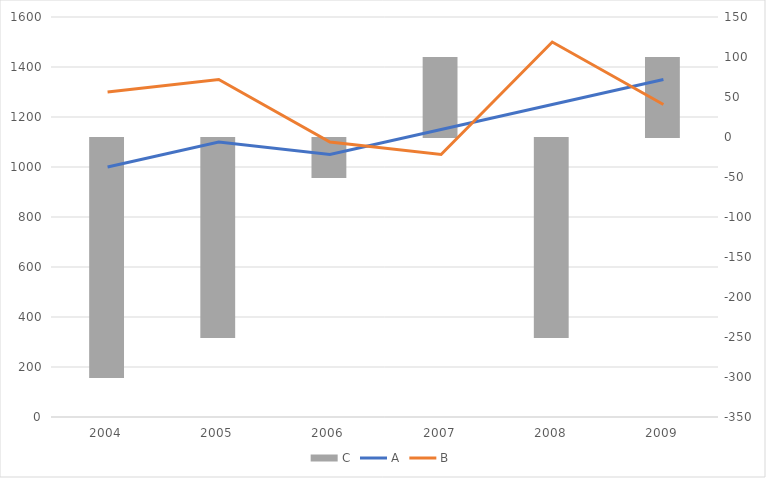
| Category | C |
|---|---|
| 2004.0 | -300 |
| 2005.0 | -250 |
| 2006.0 | -50 |
| 2007.0 | 100 |
| 2008.0 | -250 |
| 2009.0 | 100 |